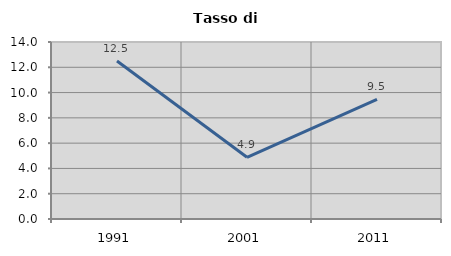
| Category | Tasso di disoccupazione   |
|---|---|
| 1991.0 | 12.5 |
| 2001.0 | 4.878 |
| 2011.0 | 9.453 |